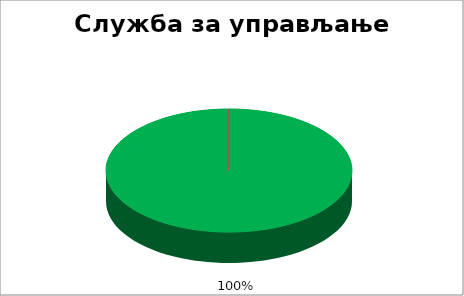
| Category | Служба за управљање кадровима  |
|---|---|
| 0 | 1 |
| 1 | 0 |
| 2 | 0 |
| 3 | 0 |
| 4 | 0 |